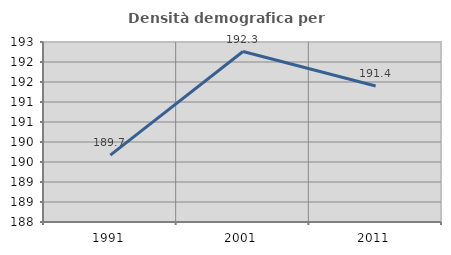
| Category | Densità demografica |
|---|---|
| 1991.0 | 189.671 |
| 2001.0 | 192.262 |
| 2011.0 | 191.398 |